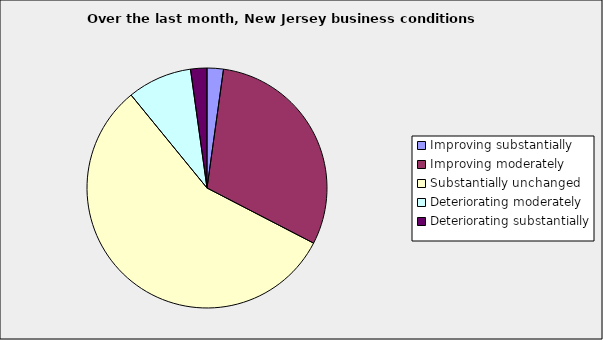
| Category | Series 0 |
|---|---|
| Improving substantially | 0.022 |
| Improving moderately | 0.304 |
| Substantially unchanged | 0.565 |
| Deteriorating moderately | 0.087 |
| Deteriorating substantially | 0.022 |